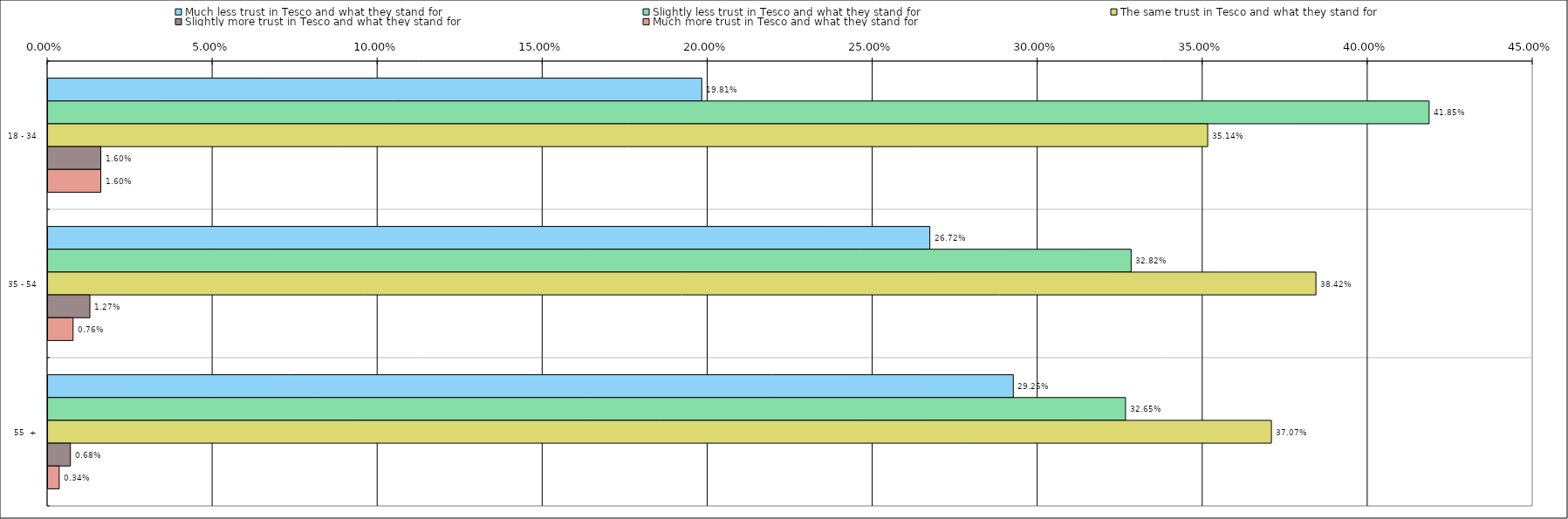
| Category | Much less trust in Tesco and what they stand for | Slightly less trust in Tesco and what they stand for | The same trust in Tesco and what they stand for | Slightly more trust in Tesco and what they stand for | Much more trust in Tesco and what they stand for |
|---|---|---|---|---|---|
| 0 | 0.198 | 0.418 | 0.351 | 0.016 | 0.016 |
| 1 | 0.267 | 0.328 | 0.384 | 0.013 | 0.008 |
| 2 | 0.292 | 0.326 | 0.371 | 0.007 | 0.003 |